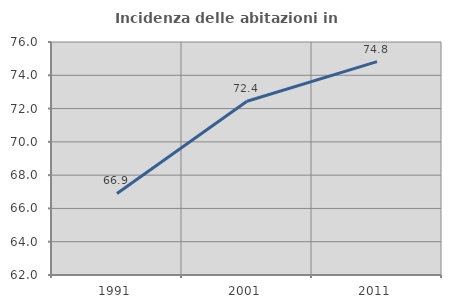
| Category | Incidenza delle abitazioni in proprietà  |
|---|---|
| 1991.0 | 66.9 |
| 2001.0 | 72.442 |
| 2011.0 | 74.817 |